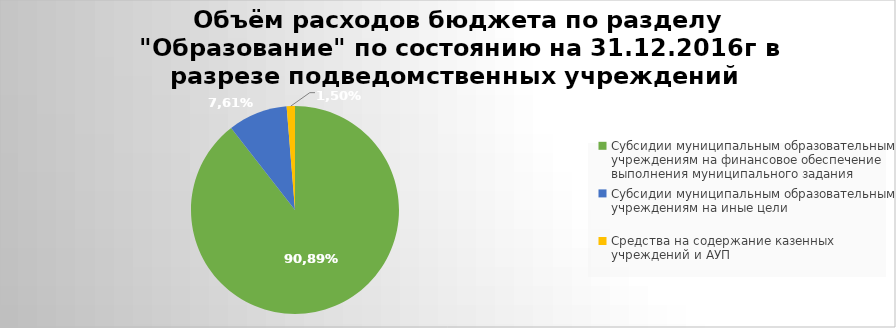
| Category | Series 0 |
|---|---|
| Субсидии муниципальным образовательным учреждениям на финансовое обеспечение выполнения муниципального задания | 4169799.6 |
| Субсидии муниципальным образовательным учреждениям на иные цели | 430352.1 |
| Средства на содержание казенных учреждений и АУП | 60069.7 |